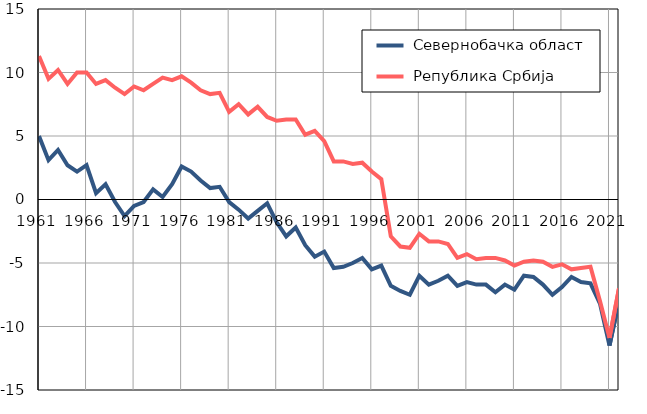
| Category |  Севернобачка област |  Република Србија |
|---|---|---|
| 1961.0 | 5 | 11.3 |
| 1962.0 | 3.1 | 9.5 |
| 1963.0 | 3.9 | 10.2 |
| 1964.0 | 2.7 | 9.1 |
| 1965.0 | 2.2 | 10 |
| 1966.0 | 2.7 | 10 |
| 1967.0 | 0.5 | 9.1 |
| 1968.0 | 1.2 | 9.4 |
| 1969.0 | -0.2 | 8.8 |
| 1970.0 | -1.3 | 8.3 |
| 1971.0 | -0.5 | 8.9 |
| 1972.0 | -0.2 | 8.6 |
| 1973.0 | 0.8 | 9.1 |
| 1974.0 | 0.2 | 9.6 |
| 1975.0 | 1.2 | 9.4 |
| 1976.0 | 2.6 | 9.7 |
| 1977.0 | 2.2 | 9.2 |
| 1978.0 | 1.5 | 8.6 |
| 1979.0 | 0.9 | 8.3 |
| 1980.0 | 1 | 8.4 |
| 1981.0 | -0.2 | 6.9 |
| 1982.0 | -0.8 | 7.5 |
| 1983.0 | -1.5 | 6.7 |
| 1984.0 | -0.9 | 7.3 |
| 1985.0 | -0.3 | 6.5 |
| 1986.0 | -1.8 | 6.2 |
| 1987.0 | -2.9 | 6.3 |
| 1988.0 | -2.2 | 6.3 |
| 1989.0 | -3.6 | 5.1 |
| 1990.0 | -4.5 | 5.4 |
| 1991.0 | -4.1 | 4.6 |
| 1992.0 | -5.4 | 3 |
| 1993.0 | -5.3 | 3 |
| 1994.0 | -5 | 2.8 |
| 1995.0 | -4.6 | 2.9 |
| 1996.0 | -5.5 | 2.2 |
| 1997.0 | -5.2 | 1.6 |
| 1998.0 | -6.8 | -2.9 |
| 1999.0 | -7.2 | -3.7 |
| 2000.0 | -7.5 | -3.8 |
| 2001.0 | -6 | -2.7 |
| 2002.0 | -6.7 | -3.3 |
| 2003.0 | -6.4 | -3.3 |
| 2004.0 | -6 | -3.5 |
| 2005.0 | -6.8 | -4.6 |
| 2006.0 | -6.5 | -4.3 |
| 2007.0 | -6.7 | -4.7 |
| 2008.0 | -6.7 | -4.6 |
| 2009.0 | -7.3 | -4.6 |
| 2010.0 | -6.7 | -4.8 |
| 2011.0 | -7.1 | -5.2 |
| 2012.0 | -6 | -4.9 |
| 2013.0 | -6.1 | -4.8 |
| 2014.0 | -6.7 | -4.9 |
| 2015.0 | -7.5 | -5.3 |
| 2016.0 | -6.9 | -5.1 |
| 2017.0 | -6.1 | -5.5 |
| 2018.0 | -6.5 | -5.4 |
| 2019.0 | -6.6 | -5.3 |
| 2020.0 | -8.2 | -8 |
| 2021.0 | -11.5 | -10.9 |
| 2022.0 | -8 | -7 |